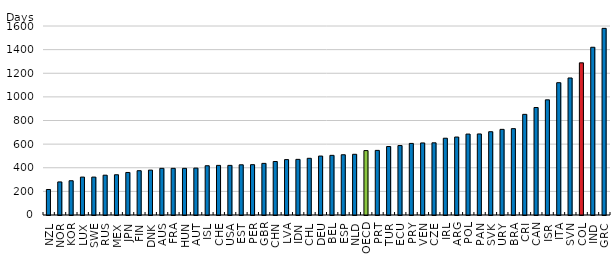
| Category | Days |
|---|---|
| NZL | 216 |
| NOR | 280 |
| KOR | 290 |
| LUX | 321 |
| SWE | 321 |
| RUS | 337 |
| MEX | 340.7 |
| JPN | 360 |
| FIN | 375 |
| DNK | 380 |
| AUS | 395 |
| FRA | 395 |
| HUN | 395 |
| AUT | 397 |
| ISL | 417 |
| CHE | 420 |
| USA | 420 |
| EST | 425 |
| PER | 426 |
| GBR | 437 |
| CHN | 452.8 |
| LVA | 469 |
| IDN | 471 |
| CHL | 480 |
| DEU | 499 |
| BEL | 505 |
| ESP | 510 |
| NLD | 514 |
| OECD | 545.277 |
| PRT | 547 |
| TUR | 580 |
| ECU | 588 |
| PRY | 606 |
| VEN | 610 |
| CZE | 611 |
| IRL | 650 |
| ARG | 660 |
| POL | 685 |
| PAN | 686 |
| SVK | 705 |
| URY | 725 |
| BRA | 731 |
| CRI | 852 |
| CAN | 910 |
| ISR | 975 |
| ITA | 1120 |
| SVN | 1160 |
| COL | 1288 |
| IND | 1420 |
| GRC | 1580 |